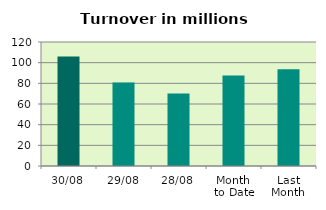
| Category | Series 0 |
|---|---|
| 30/08 | 105.923 |
| 29/08 | 80.785 |
| 28/08 | 70.231 |
| Month 
to Date | 87.619 |
| Last
Month | 93.691 |